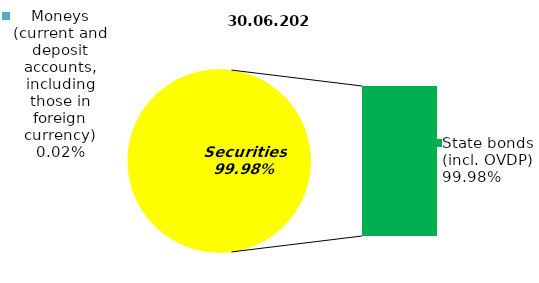
| Category | Series 0 |
|---|---|
| Moneys (current and deposit accounts, including those in foreign currency) | 0.03 |
| Bank metals | 0 |
| Real estate | 0 |
| Other assets | 0 |
| Equities | 0 |
| Corporate bonds | 0 |
| Municipal bonds | 0 |
| State bonds (incl. OVDP) | 157.177 |
| Mortgage Certificates | 0 |